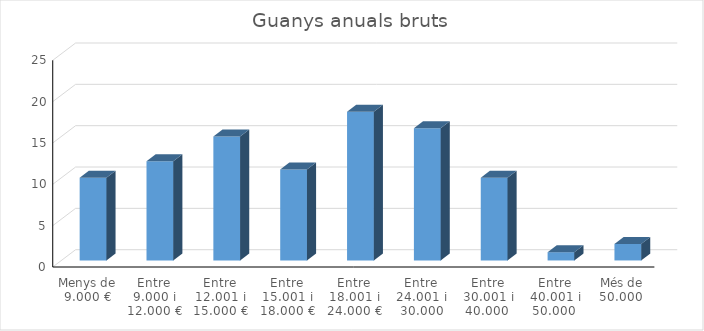
| Category | Series 0 |
|---|---|
| Menys de 9.000 € | 10 |
| Entre 9.000 i 12.000 € | 12 |
| Entre 12.001 i 15.000 € | 15 |
| Entre 15.001 i 18.000 € | 11 |
| Entre 18.001 i 24.000 € | 18 |
| Entre 24.001 i 30.000 | 16 |
| Entre 30.001 i 40.000  | 10 |
| Entre 40.001 i 50.000  | 1 |
| Més de 50.000  | 2 |